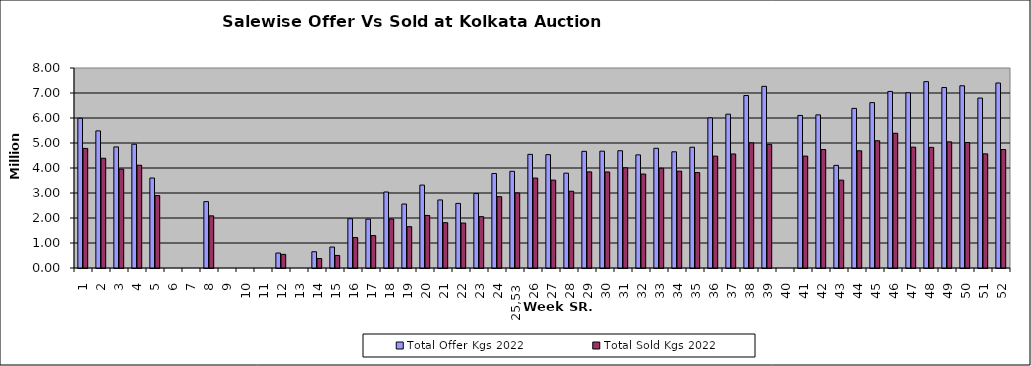
| Category | Total Offer Kgs 2022 | Total Sold Kgs 2022 |
|---|---|---|
| 1 | 5990198.8 | 4782426.5 |
| 2 | 5484993.65 | 4389772.5 |
| 3 | 4843192.1 | 3955747.9 |
| 4 | 4950490.88 | 4109808.04 |
| 5 | 3599413.4 | 2897758.75 |
| 6 | 0 | 0 |
| 7 | 0 | 0 |
| 8 | 2654911.96 | 2085878.14 |
| 9 | 0 | 0 |
| 10 | 0 | 0 |
| 11 | 0 | 0 |
| 12 | 598448.57 | 545213.22 |
| 13 | 0 | 0 |
| 14 | 650481.45 | 378377.4 |
| 15 | 838285.25 | 502369.85 |
| 16 | 1970851.99 | 1216582.63 |
| 17 | 1954503.23 | 1297834.53 |
| 18 | 3039703.95 | 1958999.7 |
| 19 | 2558456.58 | 1652724.31 |
| 20 | 3316867.58 | 2101458.83 |
| 21 | 2721878.87 | 1811263.73 |
| 22 | 2584170.36 | 1798676.04 |
| 23 | 2979224.55 | 2053927.55 |
| 24 | 3778954.34 | 2852063.46 |
| 25,53 | 3867478.63 | 3002778.93 |
| 26 | 4545232 | 3597059.2 |
| 27 | 4533964.78 | 3515155.83 |
| 28 | 3793019.15 | 3071177.6 |
| 29 | 4666359.6 | 3845589 |
| 30 | 4673704.03 | 3841319.83 |
| 31 | 4690707.77 | 4007959.07 |
| 32 | 4525199.81 | 3758523.91 |
| 33 | 4787514.81 | 3990863.41 |
| 34 | 4647883 | 3873455.4 |
| 35 | 4831029.15 | 3817170.7 |
| 36 | 6006410.97 | 4474888.51 |
| 37 | 6152336.4 | 4561841.65 |
| 38 | 6897813.93 | 5005064.92 |
| 39 | 7266594.74 | 4946025.09 |
| 40 | 0 | 0 |
| 41 | 6102326.83 | 4476194.82 |
| 42 | 6124415.57 | 4739391.34 |
| 43 | 4104465.55 | 3514713.15 |
| 44 | 6385033.26 | 4687956.61 |
| 45 | 6615099.95 | 5089275.35 |
| 46 | 7062136.66 | 5389935.81 |
| 47 | 7010448.16 | 4832936.66 |
| 48 | 7454140.33 | 4825385.48 |
| 49 | 7220509.93 | 5046145.08 |
| 50 | 7288807 | 5017814.65 |
| 51 | 6797447.4 | 4565564.65 |
| 52 | 7399628.18 | 4738680.3 |